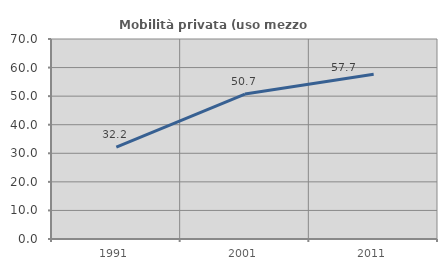
| Category | Mobilità privata (uso mezzo privato) |
|---|---|
| 1991.0 | 32.19 |
| 2001.0 | 50.725 |
| 2011.0 | 57.692 |